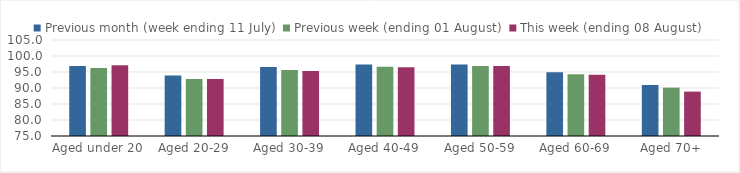
| Category | Previous month (week ending 11 July) | Previous week (ending 01 August) | This week (ending 08 August) |
|---|---|---|---|
| Aged under 20 | 96.849 | 96.227 | 97.096 |
| Aged 20-29 | 93.872 | 92.8 | 92.819 |
| Aged 30-39 | 96.578 | 95.604 | 95.348 |
| Aged 40-49 | 97.352 | 96.639 | 96.474 |
| Aged 50-59 | 97.382 | 96.859 | 96.861 |
| Aged 60-69 | 94.94 | 94.28 | 94.164 |
| Aged 70+ | 90.933 | 90.116 | 88.875 |